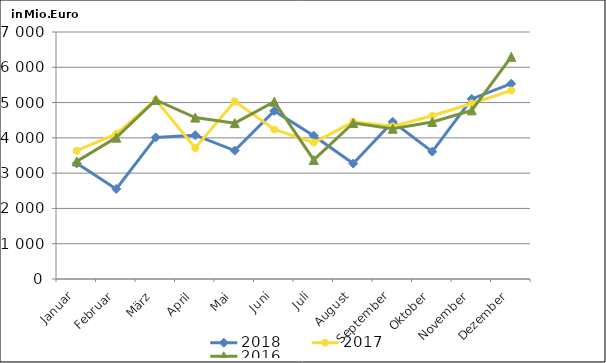
| Category | 2018 | 2017 | 2016 |
|---|---|---|---|
| Januar | 3277.388 | 3636.266 | 3333.01 |
| Februar | 2551.66 | 4110.187 | 4006.401 |
| März | 4012.68 | 5079.358 | 5074.784 |
| April | 4076.608 | 3712.319 | 4573.963 |
| Mai | 3640.036 | 5035.086 | 4417.476 |
| Juni | 4764.914 | 4237.826 | 5025.358 |
| Juli | 4061.004 | 3867.272 | 3374.087 |
| August | 3272.641 | 4455.126 | 4420.733 |
| September | 4455.43 | 4325.752 | 4258.431 |
| Oktober | 3609.193 | 4626.133 | 4450.498 |
| November | 5104.662 | 4974.047 | 4778.864 |
| Dezember | 5534.267 | 5343.445 | 6296.718 |